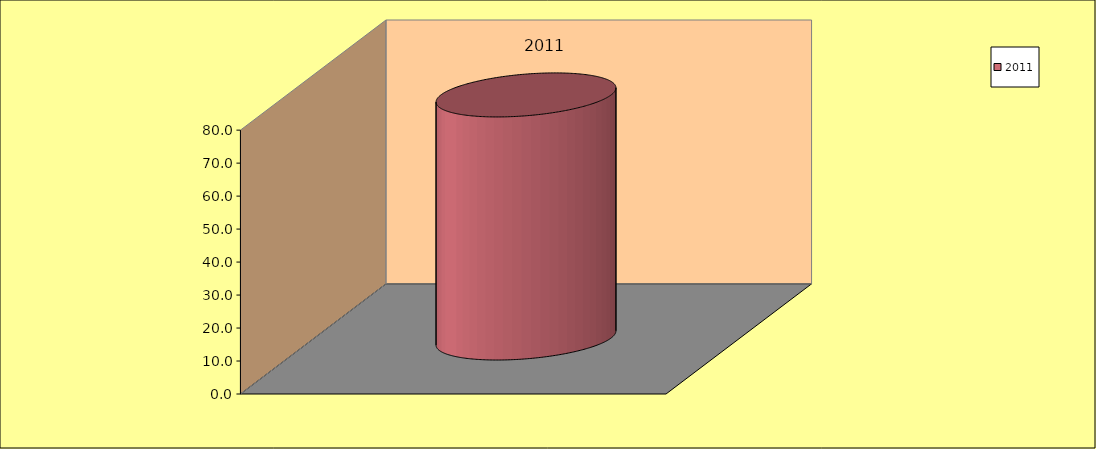
| Category | 2011 |
|---|---|
| 0 | 73.7 |